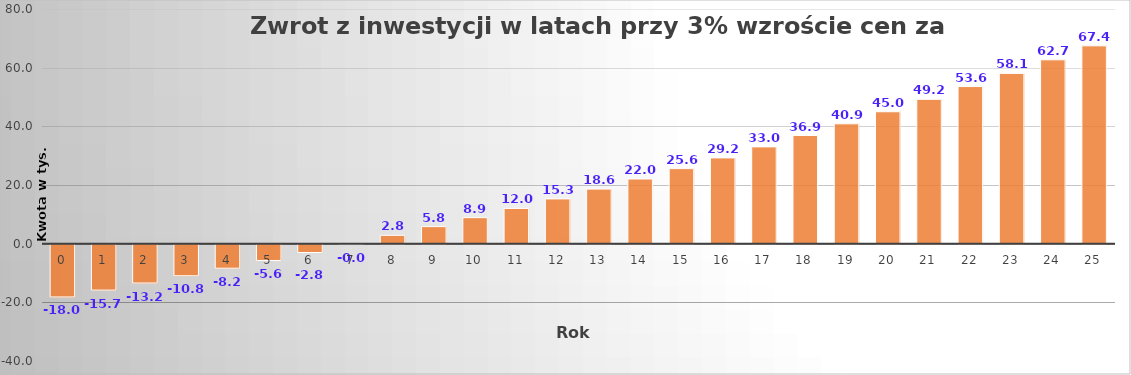
| Category | -18,0 |
|---|---|
| 0.0 | -18 |
| 1.0 | -15.657 |
| 2.0 | -13.243 |
| 3.0 | -10.757 |
| 4.0 | -8.196 |
| 5.0 | -5.558 |
| 6.0 | -2.842 |
| 7.0 | -0.044 |
| 8.0 | 2.839 |
| 9.0 | 5.807 |
| 10.0 | 8.865 |
| 11.0 | 12.014 |
| 12.0 | 15.258 |
| 13.0 | 18.599 |
| 14.0 | 22.041 |
| 15.0 | 25.585 |
| 16.0 | 29.236 |
| 17.0 | 32.997 |
| 18.0 | 36.87 |
| 19.0 | 40.86 |
| 20.0 | 44.969 |
| 21.0 | 49.201 |
| 22.0 | 53.561 |
| 23.0 | 58.051 |
| 24.0 | 62.676 |
| 25.0 | 67.44 |